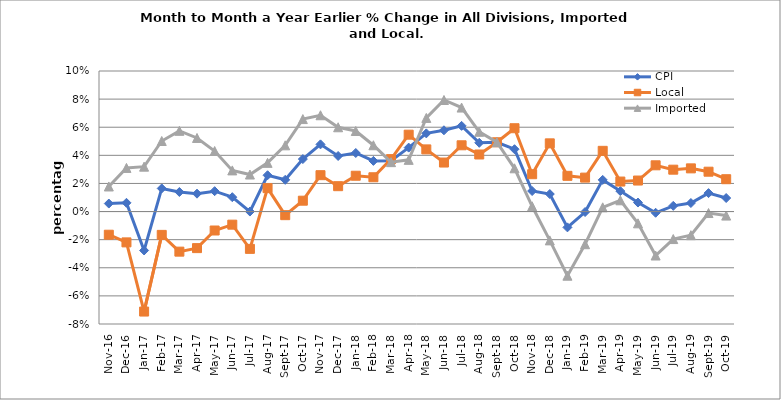
| Category | CPI | Local | Imported |
|---|---|---|---|
| 2016-11-01 | 0.006 | -0.016 | 0.018 |
| 2016-12-01 | 0.006 | -0.022 | 0.031 |
| 2017-01-01 | -0.028 | -0.071 | 0.032 |
| 2017-02-01 | 0.016 | -0.017 | 0.05 |
| 2017-03-01 | 0.014 | -0.029 | 0.057 |
| 2017-04-01 | 0.013 | -0.026 | 0.052 |
| 2017-05-01 | 0.015 | -0.013 | 0.043 |
| 2017-06-01 | 0.01 | -0.009 | 0.029 |
| 2017-07-01 | 0 | -0.027 | 0.026 |
| 2017-08-01 | 0.026 | 0.017 | 0.035 |
| 2017-09-01 | 0.023 | -0.003 | 0.047 |
| 2017-10-01 | 0.037 | 0.008 | 0.066 |
| 2017-11-01 | 0.048 | 0.026 | 0.069 |
| 2017-12-01 | 0.04 | 0.018 | 0.06 |
| 2018-01-01 | 0.042 | 0.025 | 0.057 |
| 2018-02-01 | 0.036 | 0.024 | 0.047 |
| 2018-03-01 | 0.036 | 0.037 | 0.035 |
| 2018-04-01 | 0.045 | 0.055 | 0.037 |
| 2018-05-01 | 0.056 | 0.044 | 0.067 |
| 2018-06-01 | 0.058 | 0.035 | 0.079 |
| 2018-07-01 | 0.061 | 0.047 | 0.074 |
| 2018-08-01 | 0.049 | 0.041 | 0.057 |
| 2018-09-01 | 0.049 | 0.049 | 0.049 |
| 2018-10-01 | 0.044 | 0.059 | 0.031 |
| 2018-11-01 | 0.015 | 0.027 | 0.004 |
| 2018-12-01 | 0.012 | 0.049 | -0.021 |
| 2019-01-01 | -0.011 | 0.025 | -0.046 |
| 2019-02-01 | 0 | 0.024 | -0.023 |
| 2019-03-01 | 0.023 | 0.043 | 0.003 |
| 2019-04-01 | 0.015 | 0.021 | 0.008 |
| 2019-05-01 | 0.006 | 0.022 | -0.008 |
| 2019-06-01 | -0.001 | 0.033 | -0.031 |
| 2019-07-01 | 0.004 | 0.03 | -0.02 |
| 2019-08-01 | 0.006 | 0.031 | -0.017 |
| 2019-09-01 | 0.013 | 0.028 | -0.001 |
| 2019-10-01 | 0.01 | 0.023 | -0.003 |